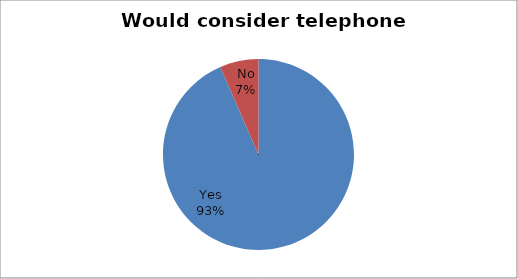
| Category | Series 0 |
|---|---|
| Yes | 342 |
| No | 24 |